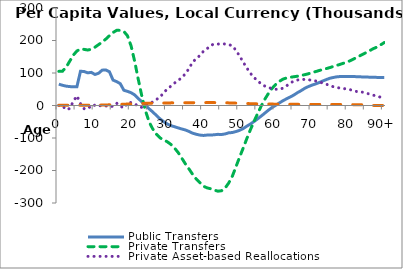
| Category | Public Transfers | Private Transfers | Private Asset-based Reallocations | Public Asset-based Reallocations |
|---|---|---|---|---|
| 0 | 65662.103 | 105003.573 | 409.245 | 702.698 |
|  | 62205.08 | 105429.066 | -525.474 | 744.13 |
| 2 | 59620.947 | 117030.174 | -12805.084 | 784.888 |
| 3 | 58184.175 | 136132 | -9387.738 | 821.83 |
| 4 | 57584.293 | 154718.36 | 12558.258 | 858.237 |
| 5 | 57567.941 | 167739.399 | 29832.312 | 891.631 |
| 6 | 105425.562 | 173893.085 | 5765.637 | 920.698 |
| 7 | 104569.903 | 172676.641 | -9784.287 | 956.716 |
| 8 | 100475.022 | 170700.926 | -3561.134 | 1003.082 |
| 9 | 101879.185 | 173089.273 | -7210.538 | 1064.035 |
| 10 | 95504.294 | 179456.863 | 1906.809 | 1153.661 |
| 11 | 99289.567 | 187273.55 | -1631.15 | 1271.999 |
| 12 | 108760.28 | 195234.133 | 505.441 | 1452.484 |
| 13 | 109381.174 | 204372.574 | -1278.227 | 1712.621 |
| 14 | 103830.426 | 214708.844 | -3613.25 | 2067.825 |
| 15 | 78190.569 | 224669.38 | -2313.543 | 2520.388 |
| 16 | 73471.748 | 231269.678 | 7025.017 | 3003.766 |
| 17 | 67182.375 | 231222.574 | -1878.314 | 3471.148 |
| 18 | 46821.916 | 227949.485 | -7783.409 | 3948.581 |
| 19 | 43554.127 | 214387.688 | 8840.617 | 4433.506 |
| 20 | 39272.629 | 183079.313 | 9180.555 | 4905.832 |
| 21 | 32470.891 | 135143.268 | 5607.07 | 5440.207 |
| 22 | 21363.847 | 79553.517 | -2979.05 | 5952.907 |
| 23 | 11001.326 | 27116.27 | -5958.595 | 6339.952 |
| 24 | 146.165 | -17433.65 | 1304.721 | 6641.411 |
| 25 | -10407.157 | -50715.407 | 3801.998 | 6872.335 |
| 26 | -20056.007 | -72599.841 | 11276.739 | 7022.254 |
| 27 | -30644.555 | -88376.703 | 18394.145 | 7198.774 |
| 28 | -41179.712 | -99582.821 | 25832.765 | 7369.357 |
| 29 | -49673.31 | -105859.138 | 39174.367 | 7524.216 |
| 30 | -56859.619 | -111545.649 | 50775.813 | 7784.635 |
| 31 | -61844.696 | -119720.962 | 59531.537 | 8071.103 |
| 32 | -65306.586 | -130728.027 | 69002.082 | 8234.82 |
| 33 | -68826.508 | -144623.585 | 77050.595 | 8365.391 |
| 34 | -72276.507 | -161713.618 | 85549.526 | 8459.082 |
| 35 | -75230.246 | -179406.329 | 97647.059 | 8472.084 |
| 36 | -79756.538 | -195119.133 | 113431.694 | 8524.403 |
| 37 | -85123.33 | -211574.413 | 133157.183 | 8590.71 |
| 38 | -88457.192 | -225970.627 | 144139.255 | 8686.507 |
| 39 | -90991.354 | -237090.84 | 153597.48 | 8834.049 |
| 40 | -92141.528 | -248147.407 | 166757.504 | 8875.849 |
| 41 | -90983.309 | -253464.834 | 174708.668 | 8839.611 |
| 42 | -90949.421 | -256141.638 | 184676.895 | 8915.479 |
| 43 | -90070.446 | -260362.054 | 189521.851 | 8890.005 |
| 44 | -88777.628 | -263619.476 | 188944.155 | 8829.286 |
| 45 | -89227.97 | -262338.825 | 189969.523 | 8656.661 |
| 46 | -87536.206 | -254101.168 | 189220.127 | 8346.543 |
| 47 | -84039.877 | -238367.683 | 187558.793 | 8043.285 |
| 48 | -83166.54 | -217543.336 | 183509.414 | 7683.667 |
| 49 | -80085.043 | -188452.29 | 169696.259 | 7292.57 |
| 50 | -76350.637 | -159074.782 | 152321.859 | 6862.763 |
| 51 | -70970.986 | -131055.767 | 133542.311 | 6431.865 |
| 52 | -63675.944 | -101863.203 | 115561.705 | 6008.222 |
| 53 | -56941.417 | -74426.563 | 99113.381 | 5627.879 |
| 54 | -49269.915 | -48755.441 | 85952.781 | 5289.544 |
| 55 | -41038.062 | -24713.385 | 75970.137 | 4972.018 |
| 56 | -32369.07 | -1295.311 | 66061.658 | 4694.33 |
| 57 | -23333.707 | 19552.838 | 59787.632 | 4499.382 |
| 58 | -14143.116 | 37536.391 | 55253.387 | 4375.61 |
| 59 | -6058.939 | 52856.084 | 51760.76 | 4267.45 |
| 60 | 701.848 | 64947.397 | 49927.878 | 4148.628 |
| 61 | 7868.682 | 74247.983 | 50034.018 | 4025.044 |
| 62 | 14708.858 | 81027.515 | 53268.945 | 3901.872 |
| 63 | 20611.786 | 84840.322 | 60525.726 | 3788.471 |
| 64 | 26062.687 | 86804.734 | 69182.999 | 3681.984 |
| 65 | 32162.189 | 88453.215 | 75281.664 | 3632.264 |
| 66 | 39436.692 | 90138.927 | 78363.583 | 3571.412 |
| 67 | 45561.079 | 92278.265 | 80765.512 | 3489.665 |
| 68 | 52688.392 | 94712.889 | 80030.171 | 3423.274 |
| 69 | 58107.444 | 97543.395 | 79811.411 | 3358.614 |
| 70 | 62499.035 | 100990.695 | 77086.56 | 3312.297 |
| 71 | 66258.077 | 104153.106 | 75787.506 | 3292.934 |
| 72 | 70441.332 | 107584.211 | 73032.214 | 3303.79 |
| 73 | 75361.709 | 110641.765 | 68949.215 | 3319.794 |
| 74 | 79798.149 | 113499.953 | 65745.808 | 3334.074 |
| 75 | 83901.449 | 116853.517 | 60706.17 | 3250.314 |
| 76 | 86411.553 | 120247.857 | 57595.778 | 3143.584 |
| 77 | 88389.473 | 123781.759 | 54967.999 | 3051.675 |
| 78 | 89237.986 | 127389.183 | 53579.678 | 2973.623 |
| 79 | 89456.112 | 131090.837 | 51744.243 | 2875.152 |
| 80 | 89051.516 | 134869.296 | 50420.453 | 2773.542 |
| 81 | 89097.49 | 139942.625 | 47256.986 | 2665.734 |
| 82 | 88880.891 | 145672.156 | 44153.006 | 2549.808 |
| 83 | 88427.426 | 151377.563 | 41491.595 | 2425.028 |
| 84 | 87879.705 | 157010.788 | 41123.373 | 2275.354 |
| 85 | 87505.695 | 162963.371 | 38268.2 | 0 |
| 86 | 87203.001 | 168933.301 | 34971.59 | 0 |
| 87 | 86901.405 | 174957.906 | 31572.325 | 0 |
| 88 | 86492.037 | 179805.714 | 29423.483 | 0 |
| 89 | 86190.812 | 186409.991 | 25407.063 | 0 |
| 90+ | 85864.201 | 193478.271 | 21024.496 | 0 |